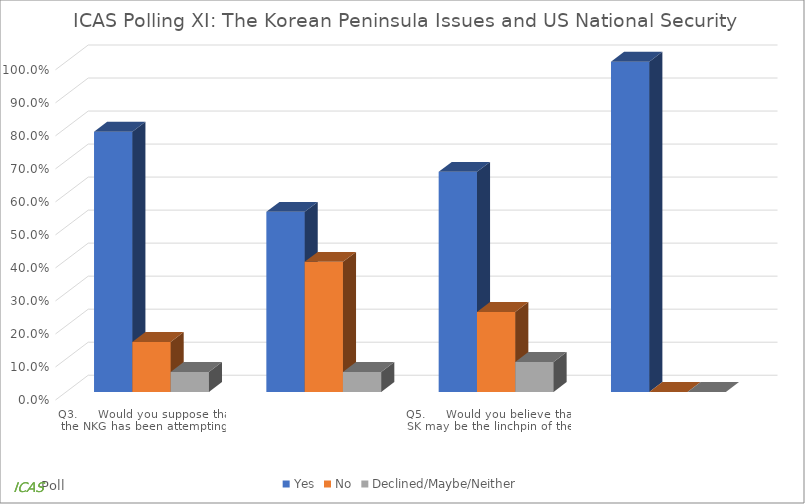
| Category | Yes | No | Declined/Maybe/Neither |
|---|---|---|---|
| Q3.     Would you suppose that the NKG has been attempting the SKG to be subservient to it? | 0.788 | 0.152 | 0.061 |
| Q4.     Would you suppose that the SKG has been accomodating the NK's demands for subservience? | 0.545 | 0.394 | 0.061 |
| Q5.     Would you believe that SK may be the linchpin of the US alliance structure in the Northeast Asia? | 0.667 | 0.242 | 0.091 |
| Q6.     Would you believe that the security of SK is in the important interest of the US national security? | 1 | 0 | 0 |